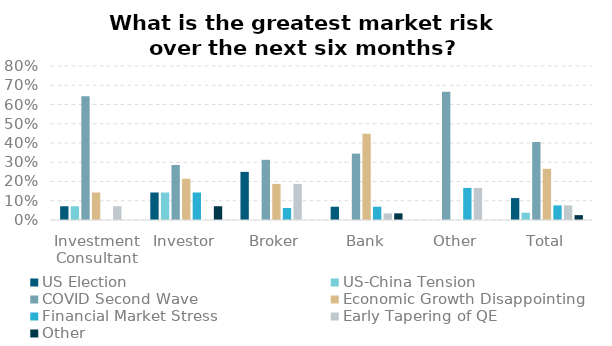
| Category | US Election | US-China Tension | COVID Second Wave | Economic Growth Disappointing | Financial Market Stress | Early Tapering of QE | Other |
|---|---|---|---|---|---|---|---|
| Investment Consultant | 0.071 | 0.071 | 0.643 | 0.143 | 0 | 0.071 | 0 |
| Investor | 0.143 | 0.143 | 0.286 | 0.214 | 0.143 | 0 | 0.071 |
| Broker | 0.25 | 0 | 0.312 | 0.188 | 0.062 | 0.188 | 0 |
| Bank | 0.069 | 0 | 0.345 | 0.448 | 0.069 | 0.034 | 0.034 |
| Other | 0 | 0 | 0.667 | 0 | 0.167 | 0.167 | 0 |
| Total | 0.114 | 0.038 | 0.405 | 0.266 | 0.076 | 0.076 | 0.025 |